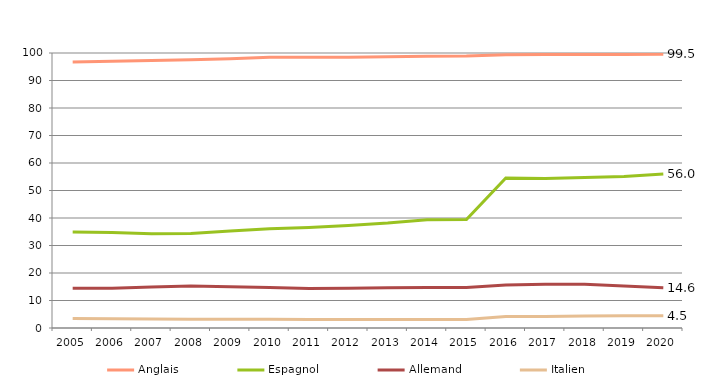
| Category | Anglais | Espagnol | Allemand | Italien |
|---|---|---|---|---|
| 2005 | 96.682 | 34.931 | 14.419 | 3.47 |
| 2006 | 96.97 | 34.753 | 14.481 | 3.361 |
| 2007 | 97.244 | 34.279 | 14.953 | 3.259 |
| 2008 | 97.561 | 34.364 | 15.252 | 3.213 |
| 2009 | 97.885 | 35.31 | 14.969 | 3.192 |
| 2010 | 98.447 | 36.077 | 14.707 | 3.155 |
| 2011 | 98.483 | 36.531 | 14.405 | 3.091 |
| 2012 | 98.451 | 37.296 | 14.466 | 3.06 |
| 2013 | 98.681 | 38.148 | 14.675 | 3.088 |
| 2014 | 98.828 | 39.33 | 14.722 | 3.11 |
| 2015 | 98.943 | 39.479 | 14.722 | 3.081 |
| 2016 | 99.403 | 54.537 | 15.609 | 4.17 |
| 2017 | 99.42 | 54.334 | 15.904 | 4.215 |
| 2018 | 99.462 | 54.726 | 15.935 | 4.355 |
| 2019 | 99.493 | 55.132 | 15.304 | 4.431 |
| 2020 | 99.531 | 56.018 | 14.62 | 4.452 |